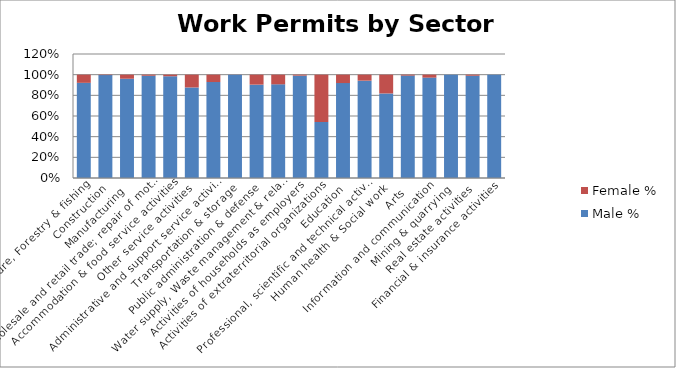
| Category | Male % | Female % |
|---|---|---|
| Agriculture, Forestry & fishing | 0.921 | 0.079 |
| Construction | 0.996 | 0.004 |
| Manufacturing | 0.961 | 0.039 |
| Wholesale and retail trade; repair of motor vehicles  | 0.99 | 0.01 |
| Accommodation & food service activities | 0.985 | 0.015 |
| Other service activities | 0.876 | 0.124 |
| Administrative and support service activities | 0.929 | 0.071 |
| Transportation & storage | 0.999 | 0.001 |
| Public administration & defense | 0.903 | 0.097 |
| Water supply, Waste management & related activities | 0.907 | 0.093 |
| Activities of households as employers | 0.991 | 0.009 |
| Activities of extraterritorial organizations  | 0.542 | 0.458 |
| Education | 0.919 | 0.081 |
| Professional, scientific and technical activities | 0.942 | 0.058 |
| Human health & Social work | 0.818 | 0.182 |
| Arts | 0.991 | 0.009 |
| Information and communication | 0.971 | 0.029 |
| Mining & quarrying | 1 | 0 |
| Real estate activities | 0.99 | 0.01 |
| Financial & insurance activities | 1 | 0 |